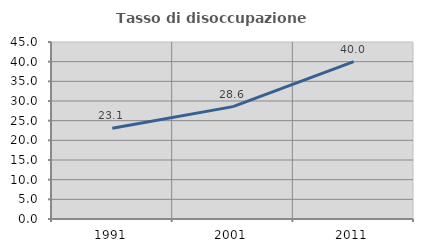
| Category | Tasso di disoccupazione giovanile  |
|---|---|
| 1991.0 | 23.077 |
| 2001.0 | 28.571 |
| 2011.0 | 40 |